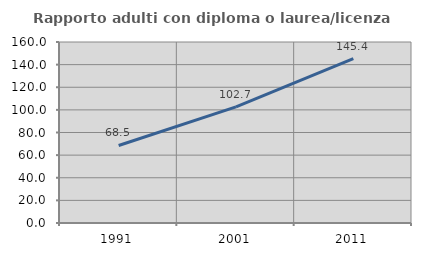
| Category | Rapporto adulti con diploma o laurea/licenza media  |
|---|---|
| 1991.0 | 68.519 |
| 2001.0 | 102.711 |
| 2011.0 | 145.375 |